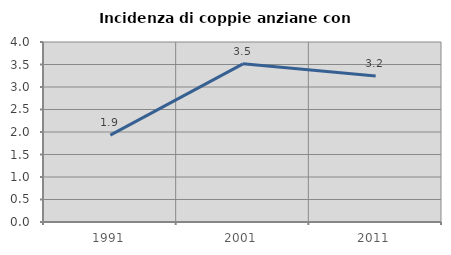
| Category | Incidenza di coppie anziane con figli |
|---|---|
| 1991.0 | 1.931 |
| 2001.0 | 3.514 |
| 2011.0 | 3.242 |